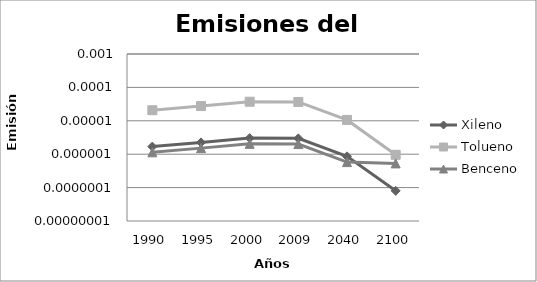
| Category | Xileno | Tolueno | Benceno |
|---|---|---|---|
| 1990.0 | 0 | 0 | 0 |
| 1995.0 | 0 | 0 | 0 |
| 2000.0 | 0 | 0 | 0 |
| 2009.0 | 0 | 0 | 0 |
| 2040.0 | 0 | 0 | 0 |
| 2100.0 | 0 | 0 | 0 |